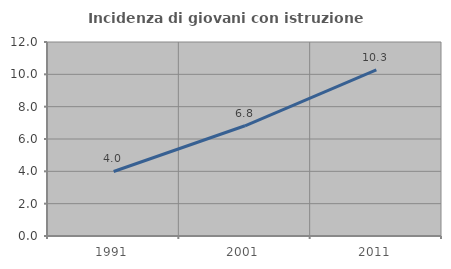
| Category | Incidenza di giovani con istruzione universitaria |
|---|---|
| 1991.0 | 3.992 |
| 2001.0 | 6.818 |
| 2011.0 | 10.283 |